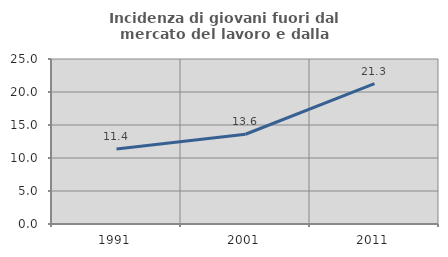
| Category | Incidenza di giovani fuori dal mercato del lavoro e dalla formazione  |
|---|---|
| 1991.0 | 11.357 |
| 2001.0 | 13.596 |
| 2011.0 | 21.256 |